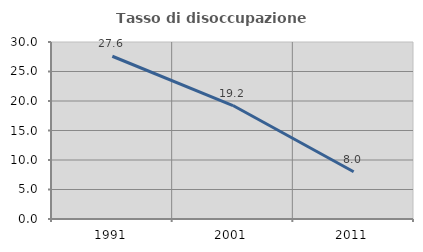
| Category | Tasso di disoccupazione giovanile  |
|---|---|
| 1991.0 | 27.586 |
| 2001.0 | 19.231 |
| 2011.0 | 8 |